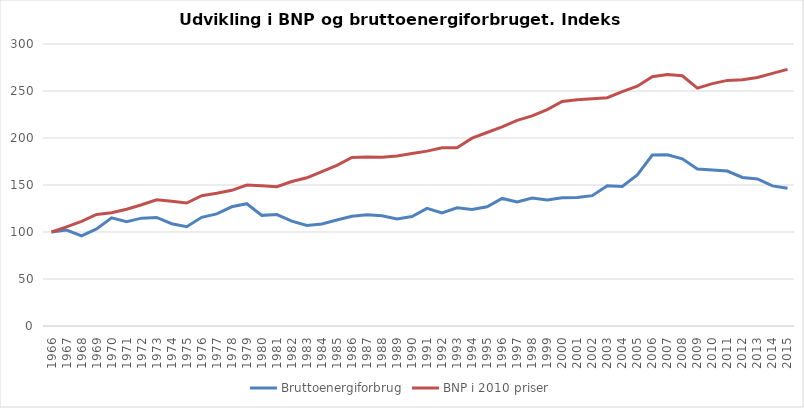
| Category | Bruttoenergiforbrug | BNP i 2010 priser |
|---|---|---|
| 1966 | 100 | 100 |
| 1967 | 102.038 | 105.53 |
| 1968 | 95.784 | 111.39 |
| 1969 | 103.315 | 118.641 |
| 1970 | 115.139 | 120.536 |
| 1971 | 111.026 | 124.158 |
| 1972 | 114.72 | 129.036 |
| 1973 | 115.467 | 134.318 |
| 1974 | 108.803 | 132.81 |
| 1975 | 105.647 | 130.876 |
| 1976 | 115.611 | 138.63 |
| 1977 | 119.306 | 141.222 |
| 1978 | 126.841 | 144.366 |
| 1979 | 130.108 | 149.952 |
| 1980 | 117.699 | 149.228 |
| 1981 | 118.568 | 148.234 |
| 1982 | 111.607 | 153.696 |
| 1983 | 106.991 | 157.686 |
| 1984 | 108.517 | 164.255 |
| 1985 | 112.826 | 170.831 |
| 1986 | 116.753 | 179.209 |
| 1987 | 118.307 | 179.665 |
| 1988 | 117.285 | 179.641 |
| 1989 | 113.915 | 180.8 |
| 1990 | 116.527 | 183.467 |
| 1991 | 125.125 | 186.024 |
| 1992 | 120.354 | 189.664 |
| 1993 | 125.73 | 189.684 |
| 1994 | 123.906 | 199.799 |
| 1995 | 126.907 | 205.848 |
| 1996 | 135.682 | 211.818 |
| 1997 | 131.982 | 218.725 |
| 1998 | 136.226 | 223.577 |
| 1999 | 134.132 | 230.168 |
| 2000 | 136.342 | 238.792 |
| 2001 | 136.692 | 240.758 |
| 2002 | 138.655 | 241.881 |
| 2003 | 149.084 | 242.824 |
| 2004 | 148.532 | 249.303 |
| 2005 | 160.781 | 255.129 |
| 2006 | 181.804 | 265.112 |
| 2007 | 182.184 | 267.522 |
| 2008 | 177.872 | 266.152 |
| 2009 | 167.015 | 253.094 |
| 2010 | 165.867 | 257.829 |
| 2011 | 164.885 | 261.276 |
| 2012 | 158.077 | 261.867 |
| 2013 | 156.388 | 264.311 |
| 2014 | 149.02 | 268.741 |
| 2015 | 146.488 | 273.057 |